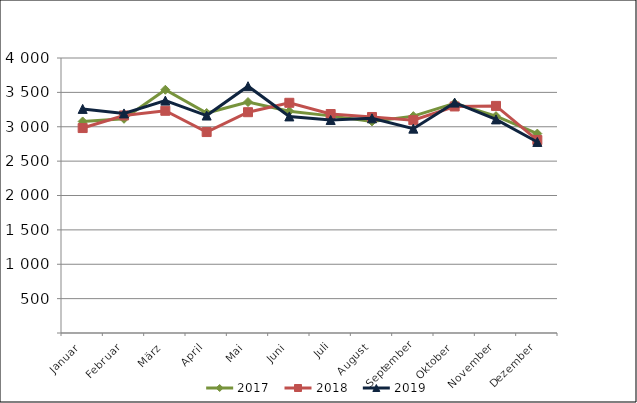
| Category | 2017 | 2018 | 2019 |
|---|---|---|---|
| Januar | 3076.863 | 2981.041 | 3259.643 |
| Februar | 3115.769 | 3164.362 | 3193.738 |
| März | 3537.961 | 3232.257 | 3380.282 |
| April | 3199.512 | 2922.732 | 3163.061 |
| Mai | 3359.494 | 3211.597 | 3589.862 |
| Juni | 3225.579 | 3348.484 | 3150.23 |
| Juli | 3158.224 | 3185.05 | 3098.941 |
| August | 3077.391 | 3142.006 | 3122.438 |
| September | 3154.469 | 3095.618 | 2972.415 |
| Oktober | 3341.49 | 3295.092 | 3351.167 |
| November | 3154.426 | 3303.213 | 3107.012 |
| Dezember | 2900.515 | 2806.8 | 2778.828 |